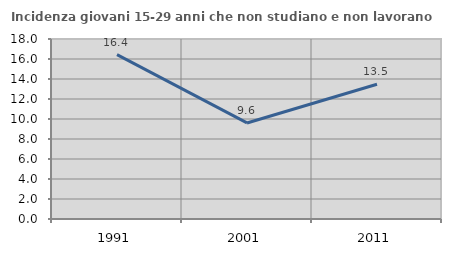
| Category | Incidenza giovani 15-29 anni che non studiano e non lavorano  |
|---|---|
| 1991.0 | 16.431 |
| 2001.0 | 9.605 |
| 2011.0 | 13.48 |